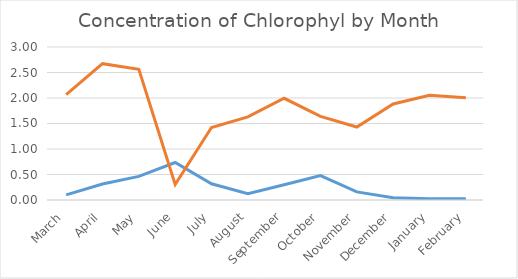
| Category | Series 0 | dissolved organic material |
|---|---|---|
| March | 0.101 | 2.065 |
| April | 0.314 | 2.672 |
| May | 0.464 | 2.563 |
| June | 0.735 | 0.304 |
| July | 0.318 | 1.421 |
| August | 0.125 | 1.63 |
| September | 0.3 | 1.994 |
| October | 0.478 | 1.639 |
| November | 0.159 | 1.43 |
| December | 0.044 | 1.882 |
| January | 0.024 | 2.052 |
| February | 0.023 | 2.004 |